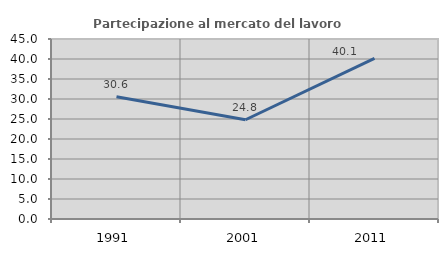
| Category | Partecipazione al mercato del lavoro  femminile |
|---|---|
| 1991.0 | 30.573 |
| 2001.0 | 24.812 |
| 2011.0 | 40.146 |